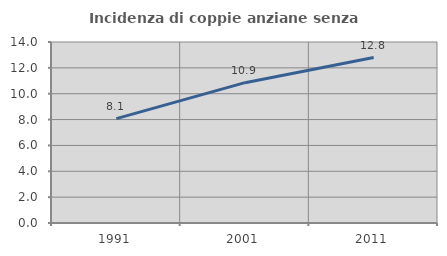
| Category | Incidenza di coppie anziane senza figli  |
|---|---|
| 1991.0 | 8.072 |
| 2001.0 | 10.854 |
| 2011.0 | 12.8 |